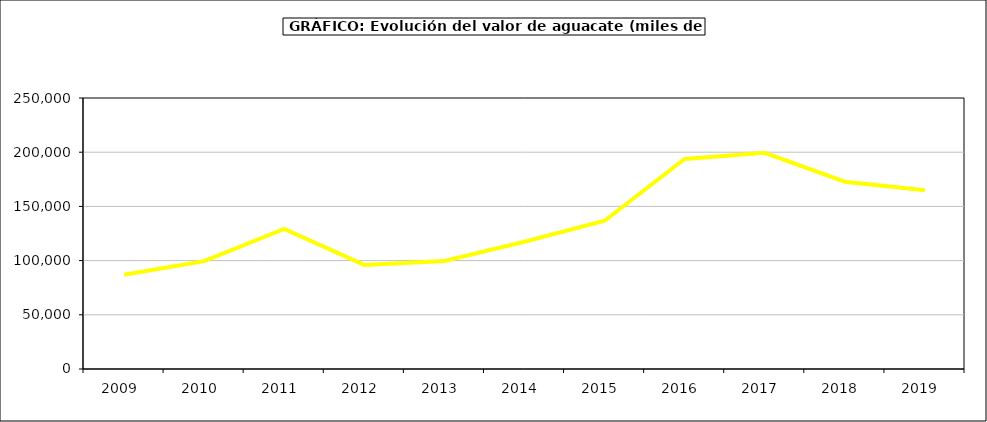
| Category | valor aguacate |
|---|---|
| 2009.0 | 86892.648 |
| 2010.0 | 99524.152 |
| 2011.0 | 129297.627 |
| 2012.0 | 96001.411 |
| 2013.0 | 99613.86 |
| 2014.0 | 117384.488 |
| 2015.0 | 136798 |
| 2016.0 | 193742 |
| 2017.0 | 199459.243 |
| 2018.0 | 172742.335 |
| 2019.0 | 164992.494 |